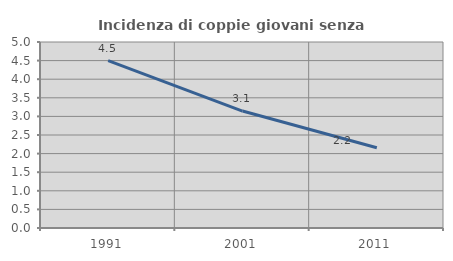
| Category | Incidenza di coppie giovani senza figli |
|---|---|
| 1991.0 | 4.497 |
| 2001.0 | 3.143 |
| 2011.0 | 2.157 |